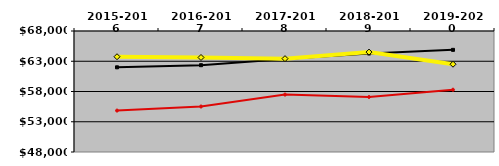
| Category | NATIONAL MEDIAN | WEST MEDIAN | TEXAS LUTHERAN |
|---|---|---|---|
| 2015-2016 | 61996.5 | 54846 | 63747 |
| 2016-2017 | 62349 | 55518 | 63624 |
| 2017-2018 | 63357 | 57485 | 63432 |
| 2018-2019 | 64282.5 | 57092 | 64514 |
| 2019-2020 | 64884.5 | 58294 | 62508 |